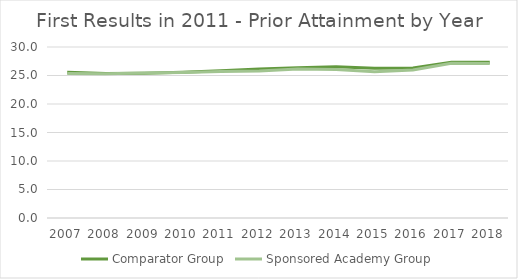
| Category | Comparator Group | Sponsored Academy Group |
|---|---|---|
| 2007.0 | 25.559 | 25.336 |
| 2008.0 | 25.361 | 25.296 |
| 2009.0 | 25.417 | 25.42 |
| 2010.0 | 25.567 | 25.547 |
| 2011.0 | 25.85 | 25.717 |
| 2012.0 | 26.132 | 25.795 |
| 2013.0 | 26.366 | 26.155 |
| 2014.0 | 26.535 | 26.045 |
| 2015.0 | 26.275 | 25.656 |
| 2016.0 | 26.315 | 25.96 |
| 2017.0 | 27.314 | 27.132 |
| 2018.0 | 27.307 | 27.088 |